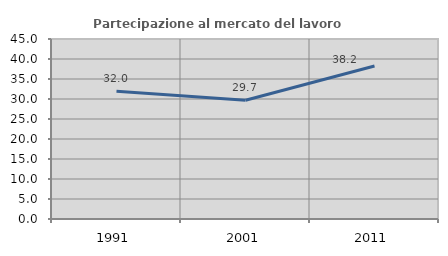
| Category | Partecipazione al mercato del lavoro  femminile |
|---|---|
| 1991.0 | 31.959 |
| 2001.0 | 29.677 |
| 2011.0 | 38.235 |